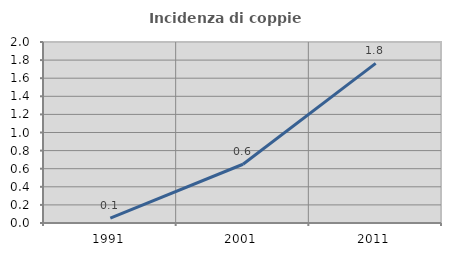
| Category | Incidenza di coppie miste |
|---|---|
| 1991.0 | 0.054 |
| 2001.0 | 0.649 |
| 2011.0 | 1.764 |